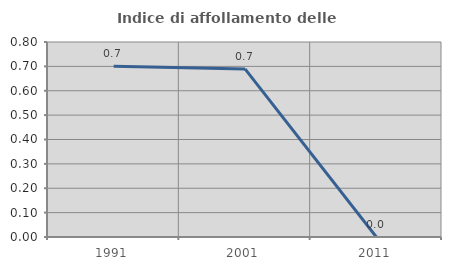
| Category | Indice di affollamento delle abitazioni  |
|---|---|
| 1991.0 | 0.701 |
| 2001.0 | 0.69 |
| 2011.0 | 0 |